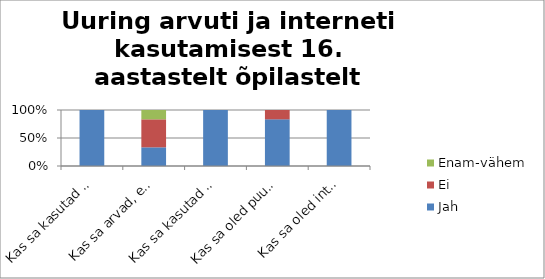
| Category | Jah | Ei | Enam-vähem |
|---|---|---|---|
| Kas sa kasutad internetti igapäevaselt? | 6 | 0 | 0 |
| Kas sa arvad, et Internet on turvaline? | 2 | 3 | 1 |
| Kas sa kasutad internetis suheldes veebikaamerat | 6 | 0 | 0 |
| Kas sa oled puutunud kokku probleemidega internetis? | 5 | 1 | 0 |
| Kas sa oled interneti ohtudest teadlik? | 6 | 0 | 0 |